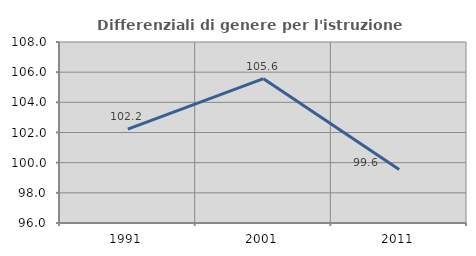
| Category | Differenziali di genere per l'istruzione superiore |
|---|---|
| 1991.0 | 102.218 |
| 2001.0 | 105.566 |
| 2011.0 | 99.551 |